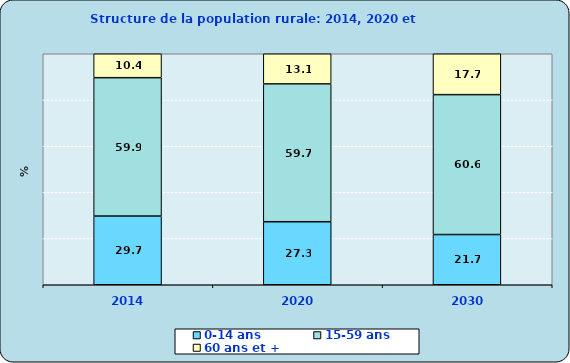
| Category | 0-14 ans  | 15-59 ans | 60 ans et + |
|---|---|---|---|
| 2014.0 | 29.732 | 59.918 | 10.35 |
| 2020.0 | 27.282 | 59.659 | 13.057 |
| 2030.0 | 21.735 | 60.571 | 17.693 |